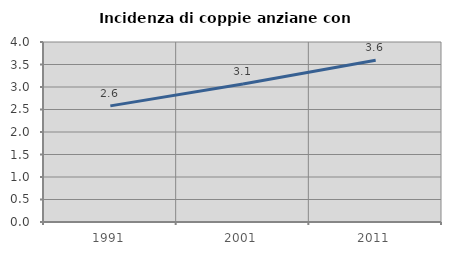
| Category | Incidenza di coppie anziane con figli |
|---|---|
| 1991.0 | 2.581 |
| 2001.0 | 3.067 |
| 2011.0 | 3.593 |